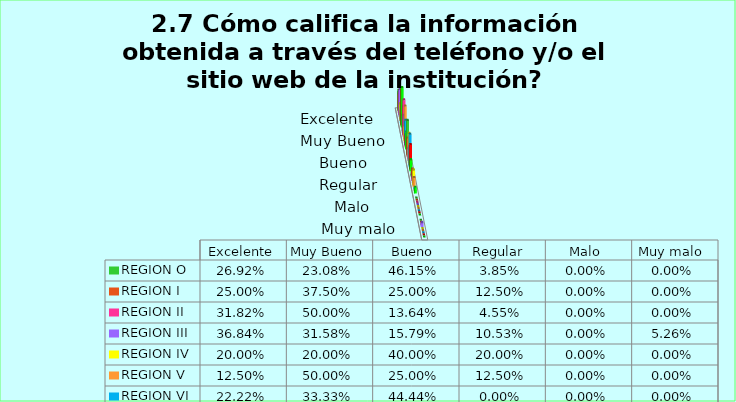
| Category | REGION O | REGION I  | REGION II | REGION III | REGION IV | REGION V  | REGION VI  | REGION VII  | REGION VIII |
|---|---|---|---|---|---|---|---|---|---|
| Excelente | 0.269 | 0.25 | 0.318 | 0.368 | 0.2 | 0.125 | 0.222 | 0.5 | 0.538 |
| Muy Bueno | 0.231 | 0.375 | 0.5 | 0.316 | 0.2 | 0.5 | 0.333 | 0.167 | 0.231 |
| Bueno  | 0.462 | 0.25 | 0.136 | 0.158 | 0.4 | 0.25 | 0.444 | 0.333 | 0.154 |
| Regular  | 0.038 | 0.125 | 0.045 | 0.105 | 0.2 | 0.125 | 0 | 0 | 0.077 |
| Malo  | 0 | 0 | 0 | 0 | 0 | 0 | 0 | 0 | 0 |
| Muy malo  | 0 | 0 | 0 | 0.053 | 0 | 0 | 0 | 0 | 0 |